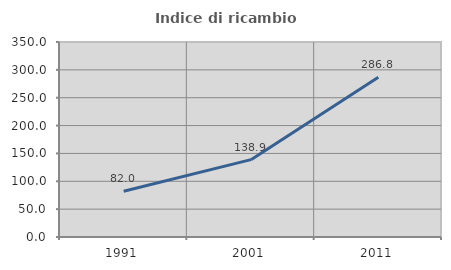
| Category | Indice di ricambio occupazionale  |
|---|---|
| 1991.0 | 81.995 |
| 2001.0 | 138.851 |
| 2011.0 | 286.832 |